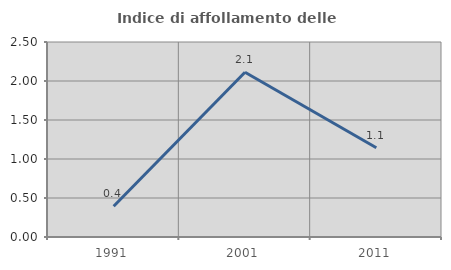
| Category | Indice di affollamento delle abitazioni  |
|---|---|
| 1991.0 | 0.394 |
| 2001.0 | 2.113 |
| 2011.0 | 1.145 |